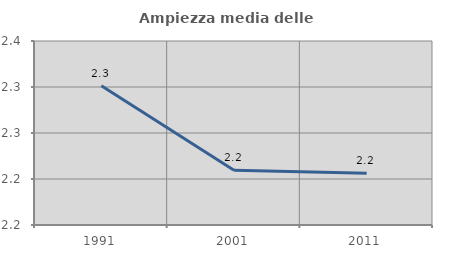
| Category | Ampiezza media delle famiglie |
|---|---|
| 1991.0 | 2.301 |
| 2001.0 | 2.21 |
| 2011.0 | 2.206 |